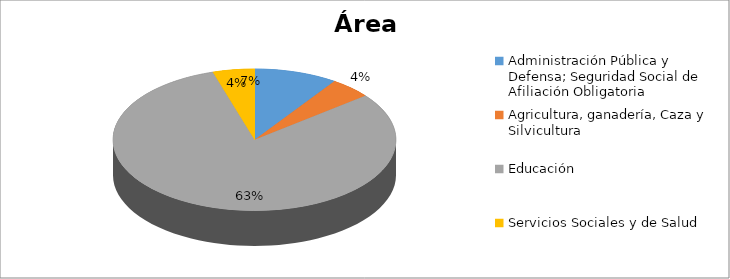
| Category | Series 0 |
|---|---|
| Administración Pública y Defensa; Seguridad Social de Afiliación Obligatoria | 0.074 |
| Agricultura, ganadería, Caza y Silvicultura | 0.037 |
| Educación | 0.63 |
| Servicios Sociales y de Salud | 0.037 |